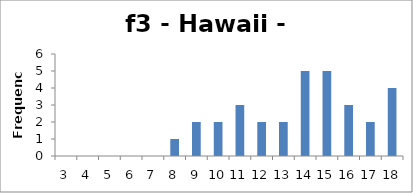
| Category | Frequency |
|---|---|
| 3.0 | 0 |
| 4.0 | 0 |
| 5.0 | 0 |
| 6.0 | 0 |
| 7.0 | 0 |
| 8.0 | 1 |
| 9.0 | 2 |
| 10.0 | 2 |
| 11.0 | 3 |
| 12.0 | 2 |
| 13.0 | 2 |
| 14.0 | 5 |
| 15.0 | 5 |
| 16.0 | 3 |
| 17.0 | 2 |
| 18.0 | 4 |